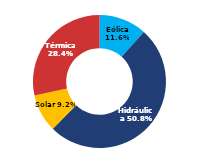
| Category | Sur |
|---|---|
| Eólica | 66.714 |
| Hidráulica | 291.165 |
| Solar | 52.872 |
| Térmica | 162.778 |